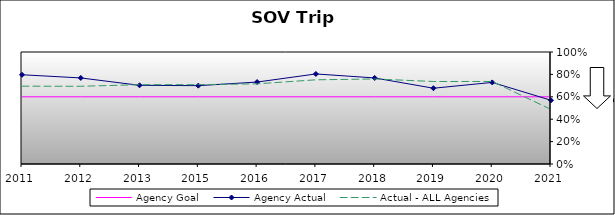
| Category | Agency Goal | Agency Actual | Actual - ALL Agencies |
|---|---|---|---|
| 2011.0 | 0.6 | 0.797 | 0.695 |
| 2012.0 | 0.6 | 0.768 | 0.694 |
| 2013.0 | 0.6 | 0.702 | 0.708 |
| 2015.0 | 0.6 | 0.699 | 0.708 |
| 2016.0 | 0.6 | 0.732 | 0.716 |
| 2017.0 | 0.6 | 0.804 | 0.752 |
| 2018.0 | 0.6 | 0.768 | 0.759 |
| 2019.0 | 0.6 | 0.676 | 0.736 |
| 2020.0 | 0.6 | 0.728 | 0.737 |
| 2021.0 | 0.6 | 0.569 | 0.487 |